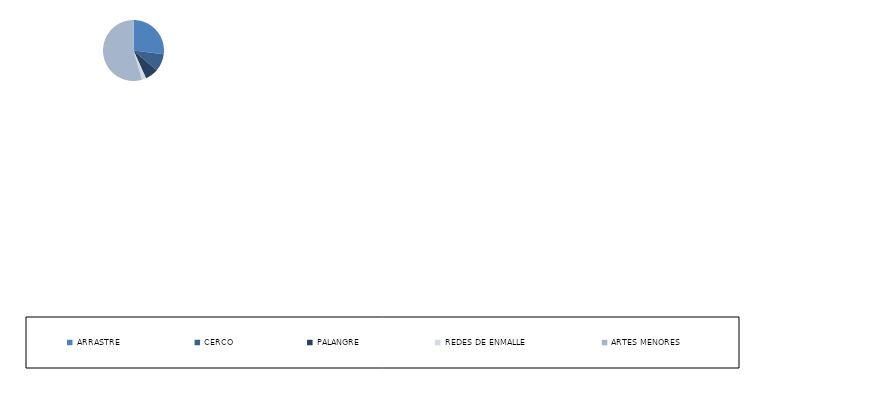
| Category | Series 0 |
|---|---|
| ARRASTRE | 485 |
| CERCO | 167 |
| PALANGRE | 126 |
| REDES DE ENMALLE | 41 |
| ARTES MENORES | 979 |